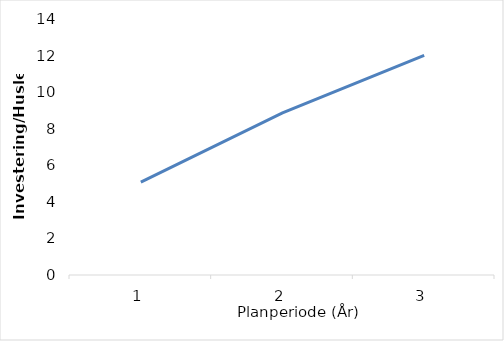
| Category | Series 0 |
|---|---|
| 0 | 5.076 |
| 1 | 8.863 |
| 2 | 12.008 |